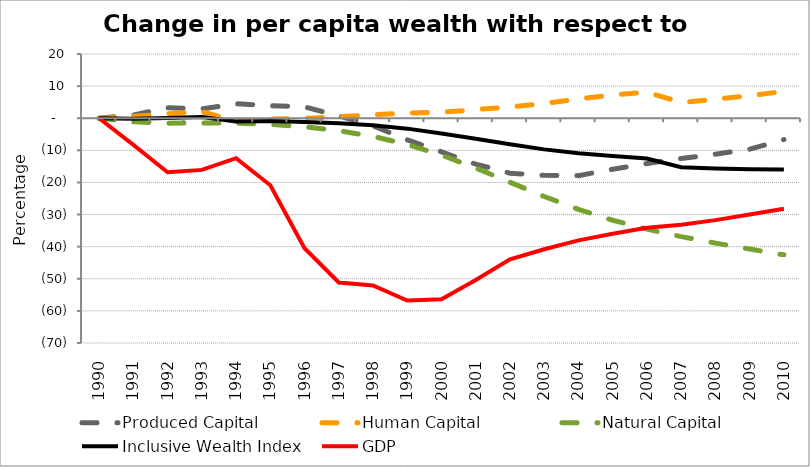
| Category | Produced Capital  | Human Capital | Natural Capital | Inclusive Wealth Index | GDP |
|---|---|---|---|---|---|
| 1990.0 | 0 | 0 | 0 | 0 | 0 |
| 1991.0 | 0.981 | 0.594 | -1.13 | -0.201 | -8.309 |
| 1992.0 | 3.277 | 1.389 | -1.528 | 0.084 | -16.826 |
| 1993.0 | 2.863 | 2.042 | -1.508 | 0.406 | -16.091 |
| 1994.0 | 4.517 | -0.944 | -1.511 | -1.033 | -12.449 |
| 1995.0 | 3.914 | -0.246 | -1.894 | -0.884 | -20.889 |
| 1996.0 | 3.534 | -0.065 | -2.695 | -1.18 | -40.495 |
| 1997.0 | 0.717 | 0.503 | -3.883 | -1.544 | -51.16 |
| 1998.0 | -2.392 | 1.065 | -5.651 | -2.191 | -52.059 |
| 1999.0 | -6.7 | 1.605 | -8.177 | -3.243 | -56.768 |
| 2000.0 | -10.462 | 1.861 | -11.481 | -4.783 | -56.366 |
| 2001.0 | -14.29 | 2.672 | -15.488 | -6.378 | -50.363 |
| 2002.0 | -17.107 | 3.544 | -19.942 | -8.119 | -43.958 |
| 2003.0 | -17.793 | 4.577 | -24.38 | -9.703 | -40.802 |
| 2004.0 | -17.877 | 5.986 | -28.382 | -10.876 | -38.048 |
| 2005.0 | -15.874 | 7.243 | -31.766 | -11.767 | -35.986 |
| 2006.0 | -14.096 | 8.158 | -34.537 | -12.551 | -34.129 |
| 2007.0 | -12.547 | 4.875 | -36.869 | -15.232 | -33.199 |
| 2008.0 | -11.21 | 5.898 | -38.891 | -15.625 | -31.729 |
| 2009.0 | -9.67 | 7.057 | -40.749 | -15.867 | -29.992 |
| 2010.0 | -6.644 | 8.339 | -42.538 | -15.966 | -28.189 |